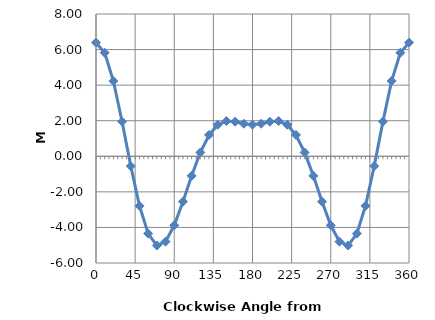
| Category | Series 0 |
|---|---|
| 0.0 | 6.39 |
| 10.0 | 5.82 |
| 20.0 | 4.23 |
| 30.0 | 1.95 |
| 40.0 | -0.552 |
| 50.0 | -2.785 |
| 60.0 | -4.346 |
| 70.0 | -5.018 |
| 80.0 | -4.8 |
| 90.0 | -3.881 |
| 100.0 | -2.553 |
| 110.0 | -1.099 |
| 120.0 | 0.215 |
| 130.0 | 1.199 |
| 140.0 | 1.774 |
| 150.0 | 1.981 |
| 160.0 | 1.945 |
| 170.0 | 1.832 |
| 180.0 | 1.778 |
| 190.0 | 1.832 |
| 200.0 | 1.945 |
| 210.0 | 1.981 |
| 220.0 | 1.774 |
| 230.0 | 1.199 |
| 240.0 | 0.215 |
| 250.0 | -1.099 |
| 260.0 | -2.553 |
| 270.0 | -3.881 |
| 280.0 | -4.8 |
| 290.0 | -5.018 |
| 300.0 | -4.346 |
| 310.0 | -2.785 |
| 320.0 | -0.552 |
| 330.0 | 1.95 |
| 340.0 | 4.23 |
| 350.0 | 5.82 |
| 360.0 | 6.39 |